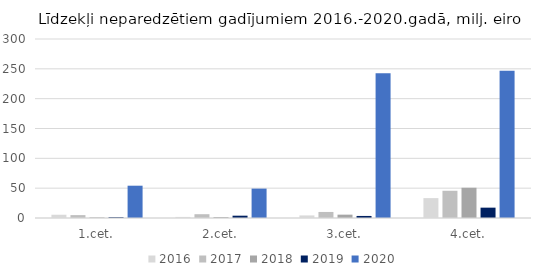
| Category | 2016 | 2017 | 2018 | 2019 | 2020 |
|---|---|---|---|---|---|
| 1.cet. | 5469179 | 4834945 | 943916 | 1294175 | 54132361 |
| 2.cet. | 1769292 | 6354033 | 1610523 | 3875824 | 49251176 |
| 3.cet. | 4329703 | 10120045 | 5605908 | 3441317 | 242419640 |
| 4.cet. | 33344807 | 45643139 | 50710457 | 17338501 | 246723212 |